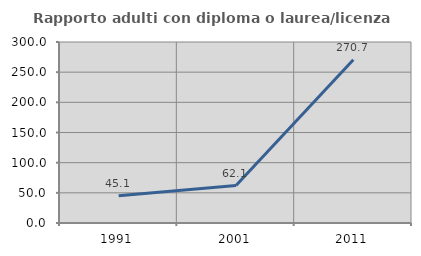
| Category | Rapporto adulti con diploma o laurea/licenza media  |
|---|---|
| 1991.0 | 45.075 |
| 2001.0 | 62.069 |
| 2011.0 | 270.727 |